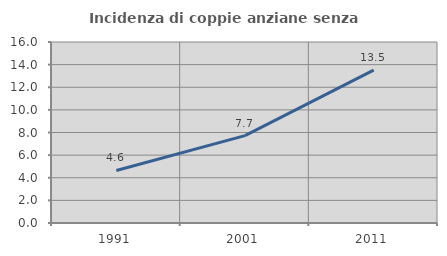
| Category | Incidenza di coppie anziane senza figli  |
|---|---|
| 1991.0 | 4.643 |
| 2001.0 | 7.726 |
| 2011.0 | 13.51 |